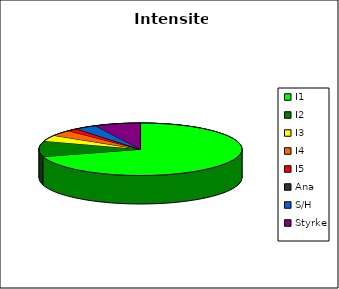
| Category | Intensitet |
|---|---|
| I1 | 910 |
| I2 | 125 |
| I3 | 47 |
| I4 | 47 |
| I5 | 22 |
| Ana | 0 |
| S/H | 45 |
| Styrke | 95 |